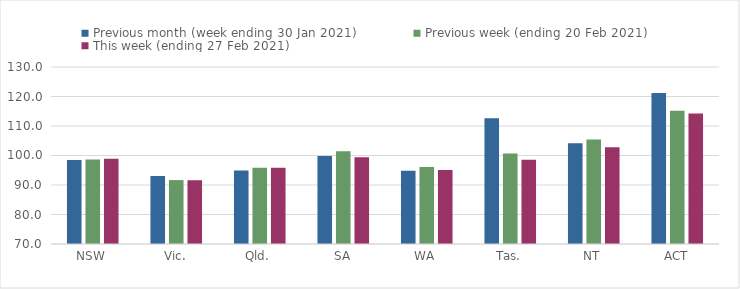
| Category | Previous month (week ending 30 Jan 2021) | Previous week (ending 20 Feb 2021) | This week (ending 27 Feb 2021) |
|---|---|---|---|
| NSW | 98.46 | 98.63 | 98.88 |
| Vic. | 93.08 | 91.67 | 91.61 |
| Qld. | 94.88 | 95.83 | 95.87 |
| SA | 99.82 | 101.41 | 99.37 |
| WA | 94.87 | 96.07 | 95.05 |
| Tas. | 112.61 | 100.69 | 98.56 |
| NT | 104.13 | 105.43 | 102.83 |
| ACT | 121.21 | 115.15 | 114.26 |